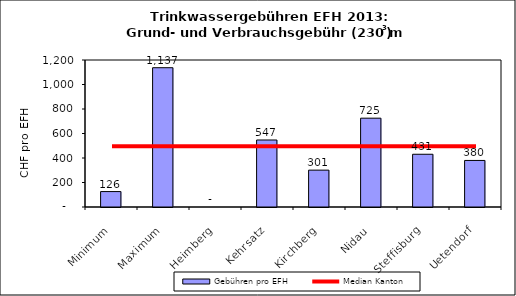
| Category | Gebühren pro EFH |
|---|---|
| Minimum | 126 |
| Maximum | 1137 |
| Heimberg | 0 |
| Kehrsatz | 547 |
| Kirchberg | 301 |
| Nidau | 725.05 |
| Steffisburg | 430.5 |
| Uetendorf | 380 |